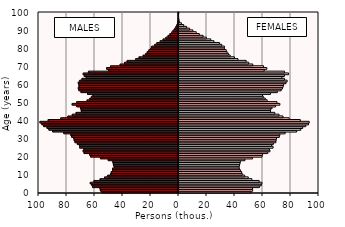
| Category | -5 162 380  | 5 350 039  |
|---|---|---|
| 0.0 | -54722 | 52107 |
| 1.0 | -55790 | 53348 |
| 2.0 | -56074 | 53213 |
| 3.0 | -61401 | 58183 |
| 4.0 | -61916 | 59508 |
| 5.0 | -63008 | 59952 |
| 6.0 | -60399 | 57984 |
| 7.0 | -56017 | 52779 |
| 8.0 | -52772 | 50181 |
| 9.0 | -50584 | 47648 |
| 10.0 | -48475 | 45890 |
| 11.0 | -48035 | 45433 |
| 12.0 | -47072 | 44545 |
| 13.0 | -47080 | 43831 |
| 14.0 | -45872 | 43636 |
| 15.0 | -46441 | 43950 |
| 16.0 | -46625 | 44308 |
| 17.0 | -46945 | 44549 |
| 18.0 | -50204 | 47813 |
| 19.0 | -55778 | 53261 |
| 20.0 | -62764 | 60007 |
| 21.0 | -63532 | 60400 |
| 22.0 | -67499 | 64117 |
| 23.0 | -68105 | 65678 |
| 24.0 | -67604 | 65308 |
| 25.0 | -70556 | 67931 |
| 26.0 | -70615 | 66894 |
| 27.0 | -72252 | 68083 |
| 28.0 | -73956 | 69899 |
| 29.0 | -74505 | 70068 |
| 30.0 | -74789 | 70390 |
| 31.0 | -76305 | 72355 |
| 32.0 | -76956 | 72755 |
| 33.0 | -81972 | 76510 |
| 34.0 | -89969 | 84815 |
| 35.0 | -92584 | 87680 |
| 36.0 | -93913 | 89054 |
| 37.0 | -96349 | 91257 |
| 38.0 | -97631 | 93227 |
| 39.0 | -98964 | 93738 |
| 40.0 | -93119 | 87338 |
| 41.0 | -84103 | 79427 |
| 42.0 | -79044 | 75017 |
| 43.0 | -75860 | 72179 |
| 44.0 | -73194 | 69102 |
| 45.0 | -69374 | 66061 |
| 46.0 | -69573 | 66095 |
| 47.0 | -70037 | 67155 |
| 48.0 | -72676 | 69683 |
| 49.0 | -75968 | 72766 |
| 50.0 | -72688 | 70700 |
| 51.0 | -65329 | 63661 |
| 52.0 | -63389 | 62317 |
| 53.0 | -62220 | 60923 |
| 54.0 | -61140 | 60397 |
| 55.0 | -64999 | 66059 |
| 56.0 | -69685 | 70953 |
| 57.0 | -71204 | 73717 |
| 58.0 | -71577 | 74605 |
| 59.0 | -71095 | 75129 |
| 60.0 | -71187 | 75487 |
| 61.0 | -71594 | 77168 |
| 62.0 | -70540 | 77956 |
| 63.0 | -68928 | 76034 |
| 64.0 | -65898 | 74210 |
| 65.0 | -67333 | 76012 |
| 66.0 | -68095 | 78962 |
| 67.0 | -64341 | 76098 |
| 68.0 | -50027 | 61555 |
| 69.0 | -51385 | 63448 |
| 70.0 | -48598 | 61122 |
| 71.0 | -41711 | 53417 |
| 72.0 | -38598 | 50497 |
| 73.0 | -36702 | 48683 |
| 74.0 | -30587 | 42857 |
| 75.0 | -28237 | 40330 |
| 76.0 | -25258 | 37270 |
| 77.0 | -23397 | 36062 |
| 78.0 | -22267 | 35051 |
| 79.0 | -21160 | 34435 |
| 80.0 | -19784 | 33133 |
| 81.0 | -19143 | 33146 |
| 82.0 | -16988 | 31229 |
| 83.0 | -15437 | 29594 |
| 84.0 | -13071 | 25671 |
| 85.0 | -11021 | 23425 |
| 86.0 | -9016 | 20203 |
| 87.0 | -7477 | 17929 |
| 88.0 | -6130 | 15192 |
| 89.0 | -4760 | 13007 |
| 90.0 | -3843 | 10653 |
| 91.0 | -2720 | 8300 |
| 92.0 | -1926 | 6180 |
| 93.0 | -1224 | 4055 |
| 94.0 | -732 | 2411 |
| 95.0 | -269 | 970 |
| 96.0 | -196 | 766 |
| 97.0 | -139 | 525 |
| 98.0 | -95 | 443 |
| 99.0 | -88 | 403 |
| 100.0 | -174 | 581 |